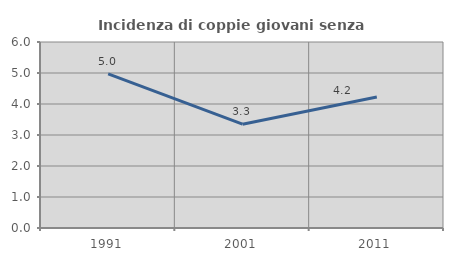
| Category | Incidenza di coppie giovani senza figli |
|---|---|
| 1991.0 | 4.97 |
| 2001.0 | 3.349 |
| 2011.0 | 4.225 |